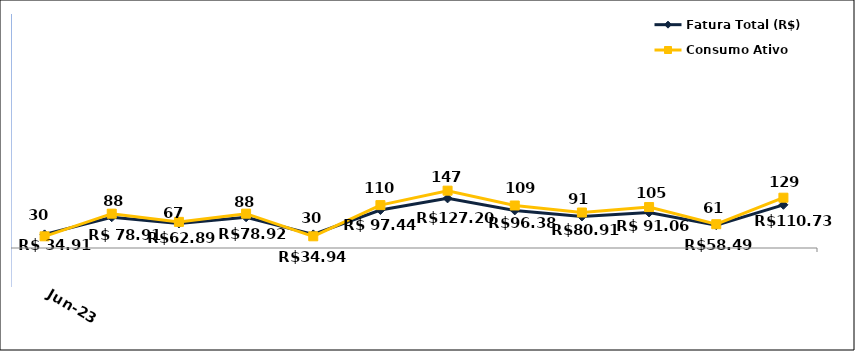
| Category | Fatura Total (R$) | Consumo Ativo (kWh) |
|---|---|---|
| 2023-06-01 | 34.91 | 30 |
| 2023-07-01 | 78.91 | 88 |
| 2023-08-01 | 62.89 | 67 |
| 2023-09-01 | 78.92 | 88 |
| 2023-10-01 | 34.94 | 30 |
| 2023-11-01 | 97.44 | 110 |
| 2023-12-01 | 127.2 | 147 |
| 2024-01-01 | 96.38 | 109 |
| 2024-02-01 | 80.91 | 91 |
| 2024-03-01 | 91.06 | 105 |
| 2024-04-01 | 58.49 | 61 |
| 2024-05-01 | 110.73 | 129 |